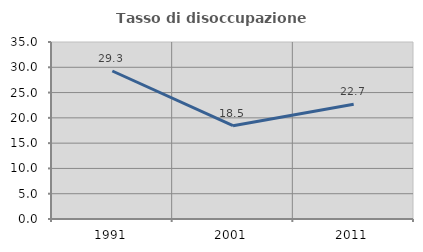
| Category | Tasso di disoccupazione giovanile  |
|---|---|
| 1991.0 | 29.264 |
| 2001.0 | 18.456 |
| 2011.0 | 22.684 |